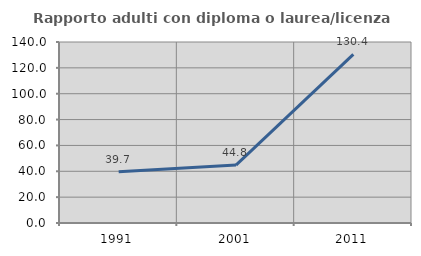
| Category | Rapporto adulti con diploma o laurea/licenza media  |
|---|---|
| 1991.0 | 39.669 |
| 2001.0 | 44.8 |
| 2011.0 | 130.449 |